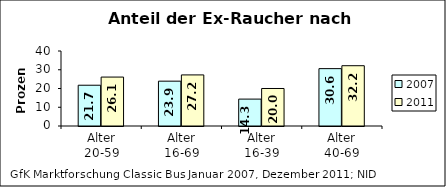
| Category | 2007 | 2011 |
|---|---|---|
| Alter
20-59 | 21.743 | 26.095 |
| Alter
16-69 | 23.912 | 27.246 |
| Alter
16-39 | 14.348 | 20.002 |
| Alter
40-69 | 30.598 | 32.153 |